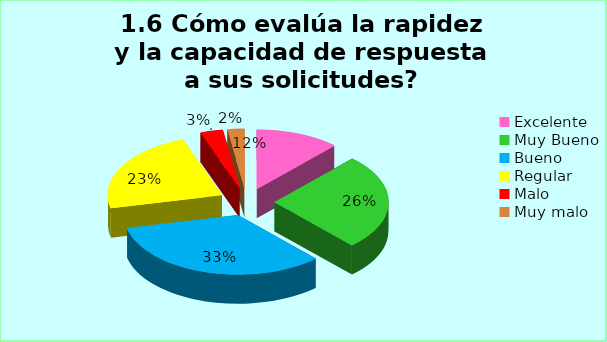
| Category | Series 0 |
|---|---|
| Excelente | 0.119 |
| Muy Bueno | 0.262 |
| Bueno  | 0.333 |
| Regular  | 0.23 |
| Malo  | 0.032 |
| Muy malo  | 0.024 |